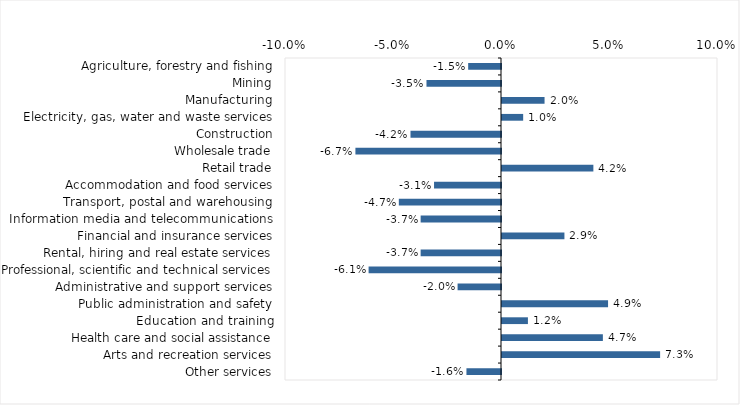
| Category | This week |
|---|---|
| Agriculture, forestry and fishing | -0.015 |
| Mining | -0.034 |
| Manufacturing | 0.02 |
| Electricity, gas, water and waste services | 0.01 |
| Construction | -0.042 |
| Wholesale trade | -0.067 |
| Retail trade | 0.042 |
| Accommodation and food services | -0.031 |
| Transport, postal and warehousing | -0.047 |
| Information media and telecommunications | -0.037 |
| Financial and insurance services | 0.029 |
| Rental, hiring and real estate services | -0.037 |
| Professional, scientific and technical services | -0.061 |
| Administrative and support services | -0.02 |
| Public administration and safety | 0.049 |
| Education and training | 0.012 |
| Health care and social assistance | 0.047 |
| Arts and recreation services | 0.073 |
| Other services | -0.016 |